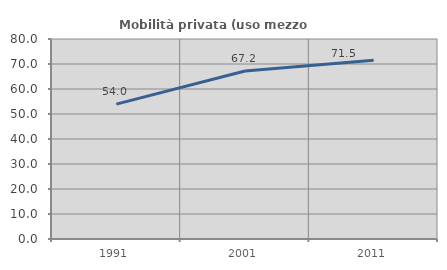
| Category | Mobilità privata (uso mezzo privato) |
|---|---|
| 1991.0 | 53.953 |
| 2001.0 | 67.194 |
| 2011.0 | 71.54 |